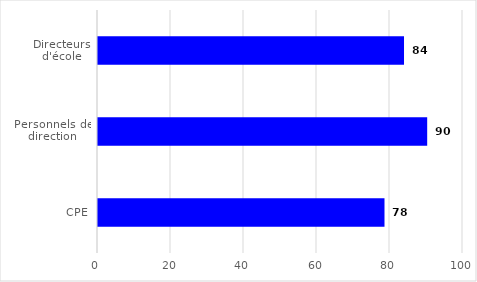
| Category | Series 0 |
|---|---|
| Directeurs d'école | 83.839 |
| Personnels de direction | 90.189 |
| CPE | 78.491 |